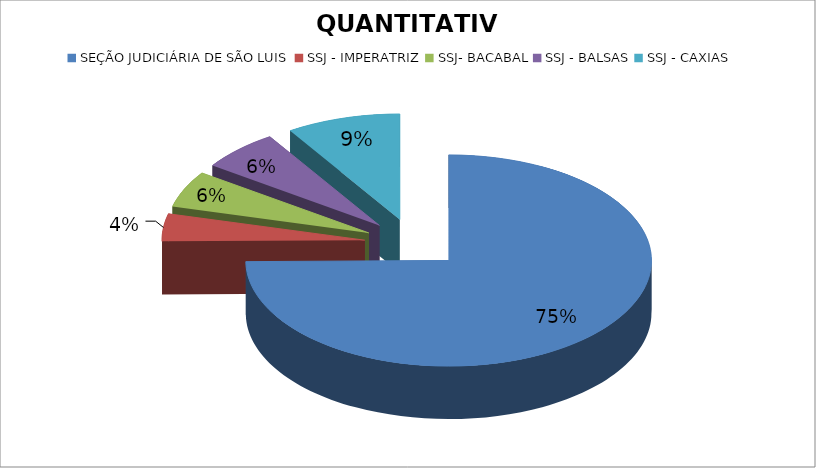
| Category | QUANTITATIVO |
|---|---|
| SEÇÃO JUDICIÁRIA DE SÃO LUIS | 107 |
| SSJ - IMPERATRIZ | 6 |
| SSJ- BACABAL | 8 |
| SSJ - BALSAS | 9 |
| SSJ - CAXIAS | 13 |